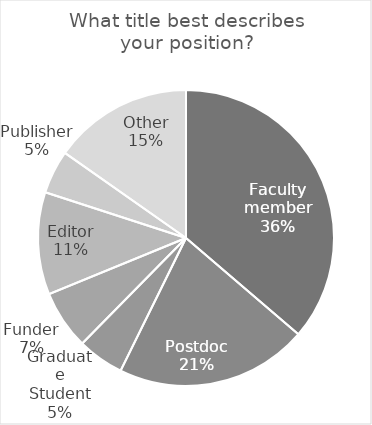
| Category | What title best describes your position? |
|---|---|
| Faculty member | 107 |
| Postdoc | 62 |
| Graduate Student | 15 |
| Funder | 19 |
| Editor | 33 |
| Publisher | 14 |
| Other | 45 |